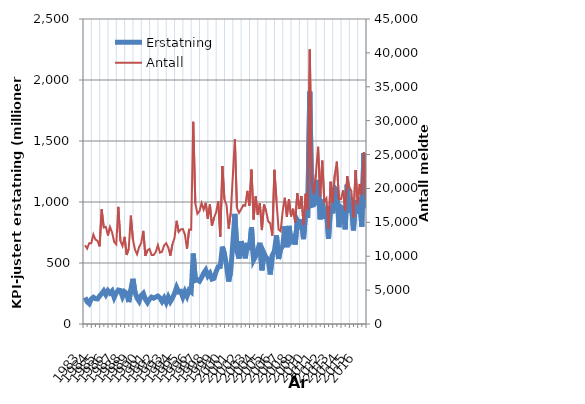
| Category | Erstatning |
|---|---|
| 1983.0 | 217.738 |
| nan | 182.39 |
| nan | 166.795 |
| nan | 204.317 |
| 1984.0 | 219.095 |
| nan | 207.248 |
| nan | 205.483 |
| nan | 229.834 |
| 1985.0 | 248.366 |
| nan | 271.471 |
| nan | 240.555 |
| nan | 272.822 |
| 1986.0 | 252.948 |
| nan | 270.665 |
| nan | 217.848 |
| nan | 254.933 |
| 1987.0 | 278.509 |
| nan | 274.837 |
| nan | 224.911 |
| nan | 264.614 |
| 1988.0 | 251.86 |
| nan | 179.537 |
| nan | 279.633 |
| nan | 370.436 |
| 1989.0 | 261.704 |
| nan | 211.52 |
| nan | 186.12 |
| nan | 234.811 |
| 1990.0 | 251.421 |
| nan | 202.269 |
| nan | 175.421 |
| nan | 204.183 |
| 1991.0 | 220.333 |
| nan | 211.849 |
| nan | 221.715 |
| nan | 229.225 |
| 1992.0 | 214.139 |
| nan | 184.514 |
| nan | 213.2 |
| nan | 175.933 |
| 1993.0 | 220.747 |
| nan | 183.711 |
| nan | 212.245 |
| nan | 251.093 |
| 1994.0 | 300.738 |
| nan | 262.914 |
| nan | 267.117 |
| nan | 220.171 |
| 1995.0 | 265.26 |
| nan | 228.202 |
| nan | 277.29 |
| nan | 263.273 |
| 1996.0 | 577.355 |
| nan | 357.508 |
| nan | 363.895 |
| nan | 350.948 |
| 1997.0 | 379.933 |
| nan | 416.911 |
| nan | 441.514 |
| nan | 393.933 |
| 1998.0 | 415.589 |
| nan | 368.173 |
| nan | 374.188 |
| nan | 430.086 |
| 1999.0 | 469.101 |
| nan | 471.379 |
| nan | 634.301 |
| nan | 574.443 |
| 2000.0 | 478.837 |
| nan | 347.74 |
| nan | 431.1 |
| nan | 657.294 |
| 2001.0 | 902.061 |
| nan | 597.168 |
| nan | 536.336 |
| nan | 678.575 |
| 2002.0 | 618.016 |
| nan | 537.735 |
| nan | 664.547 |
| nan | 605.551 |
| 2003.0 | 791.978 |
| nan | 523.627 |
| nan | 557.072 |
| nan | 606.848 |
| 2004.0 | 665.746 |
| nan | 440.146 |
| nan | 581.891 |
| nan | 543.889 |
| 2005.0 | 532.334 |
| nan | 406.244 |
| nan | 563.978 |
| nan | 597.674 |
| 2006.0 | 726.484 |
| nan | 532.776 |
| nan | 613.024 |
| nan | 639.554 |
| 2007.0 | 800.528 |
| nan | 629.384 |
| nan | 804.144 |
| nan | 679.889 |
| 2008.0 | 703.094 |
| nan | 650.888 |
| nan | 850.097 |
| nan | 816.43 |
| 2009.0 | 856.753 |
| nan | 695.547 |
| nan | 918.799 |
| nan | 868.457 |
| 2010.0 | 1905.043 |
| nan | 971.666 |
| nan | 976.341 |
| nan | 998.838 |
| 2011.0 | 1180.444 |
| nan | 858.391 |
| nan | 1023.5 |
| nan | 862.569 |
| 2012.0 | 955.608 |
| nan | 698.637 |
| nan | 963.225 |
| nan | 906.967 |
| 2013.0 | 1113.851 |
| nan | 1090.67 |
| nan | 793.622 |
| nan | 958.603 |
| 2014.0 | 945.44 |
| nan | 776.393 |
| nan | 1142.115 |
| nan | 913.19 |
| 2015.0 | 1001.888 |
| nan | 767.27 |
| nan | 1015.647 |
| nan | 901.778 |
| 2016.0 | 1036.665 |
| nan | 797.959 |
| nan | 1399.479 |
| nan | 949.547 |